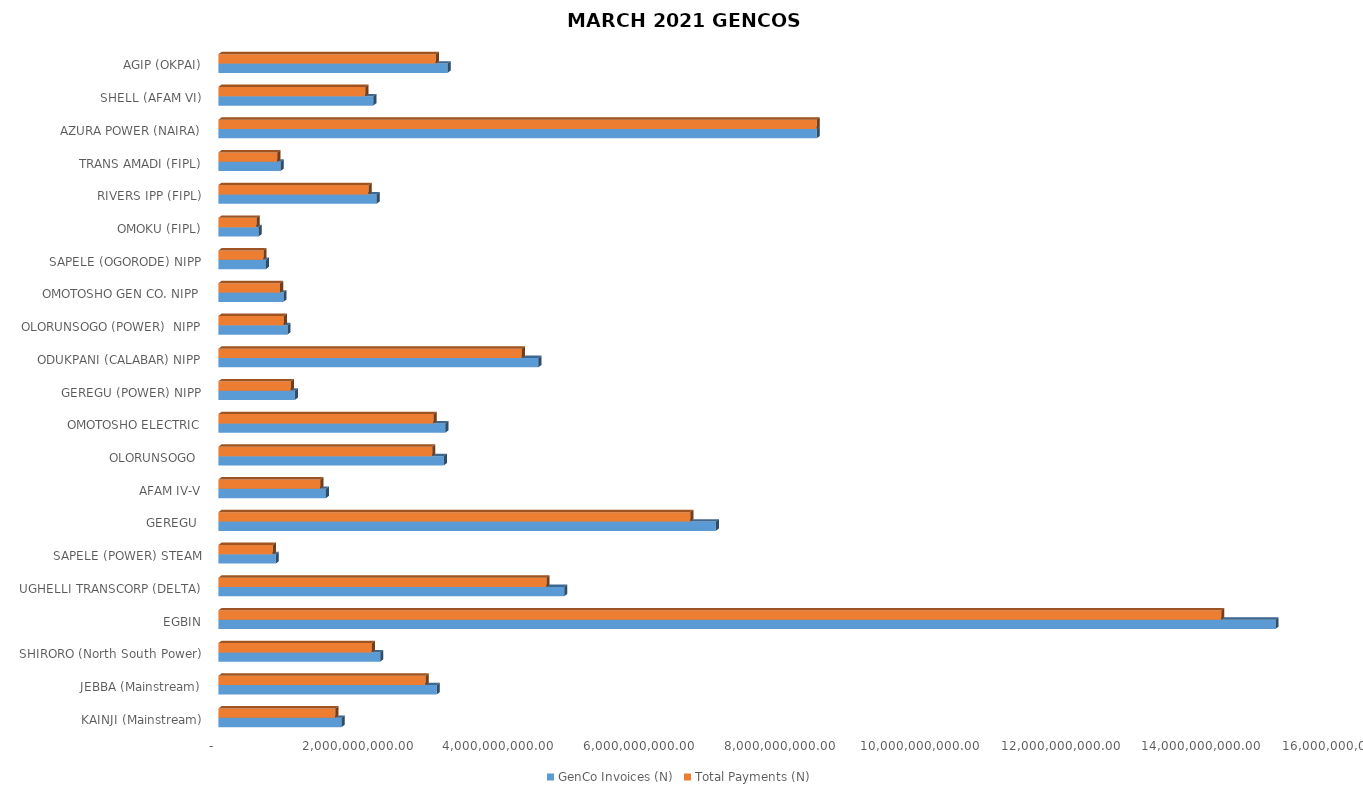
| Category | GenCo Invoices (N) | Total Payments (N) |
|---|---|---|
| KAINJI (Mainstream) | 1752480482.48 | 1662495464.489 |
| JEBBA (Mainstream) | 3106643347.95 | 2947125818.168 |
| SHIRORO (North South Power) | 2302173248.67 | 2183963029.914 |
| EGBIN | 15045056237.83 | 14272534278.374 |
| UGHELLI TRANSCORP (DELTA) | 4921562608.8 | 4668854002.728 |
| SAPELE (POWER) STEAM | 815209047.65 | 773350321.375 |
| GEREGU  | 7078773323.2 | 6715297922.926 |
| AFAM IV-V | 1529638889.28 | 1451096169.776 |
| OLORUNSOGO  | 3207137106.151 | 3042459500.277 |
| OMOTOSHO ELECTRIC | 3228753769.46 | 3062966207.808 |
| GEREGU (POWER) NIPP | 1086287524.75 | 1030509669.627 |
| ODUKPANI (CALABAR) NIPP | 4553069587.09 | 4319282076.87 |
| OLORUNSOGO (POWER)  NIPP | 981890609.69 | 931473246.951 |
| OMOTOSHO GEN CO. NIPP | 925264545.07 | 877754773.882 |
| SAPELE (OGORODE) NIPP | 675164917.89 | 640497069.723 |
| OMOKU (FIPL) | 571262541.79 | 541929792.801 |
| RIVERS IPP (FIPL) | 2251385614.62 | 2135783200.179 |
| TRANS AMADI (FIPL) | 883884555.83 | 838499532.457 |
| AZURA POWER (NAIRA) | 8515276913.44 | 8515276912.051 |
| SHELL (AFAM VI) | 2203200046.74 | 2090071827.724 |
| AGIP (OKPAI) | 3260260755.101 | 3092855397.018 |